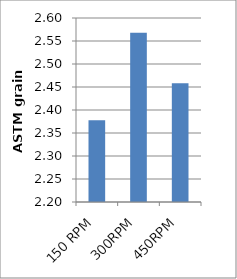
| Category | Series 0 |
|---|---|
| 150 RPM | 2.378 |
| 300RPM | 2.568 |
| 450RPM | 2.458 |